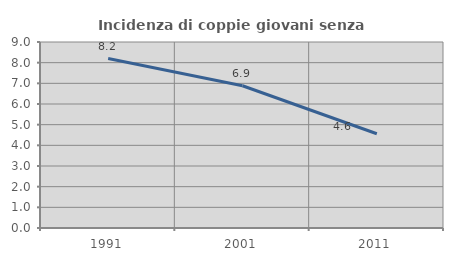
| Category | Incidenza di coppie giovani senza figli |
|---|---|
| 1991.0 | 8.199 |
| 2001.0 | 6.884 |
| 2011.0 | 4.56 |